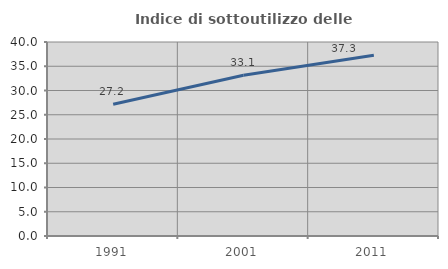
| Category | Indice di sottoutilizzo delle abitazioni  |
|---|---|
| 1991.0 | 27.158 |
| 2001.0 | 33.134 |
| 2011.0 | 37.29 |